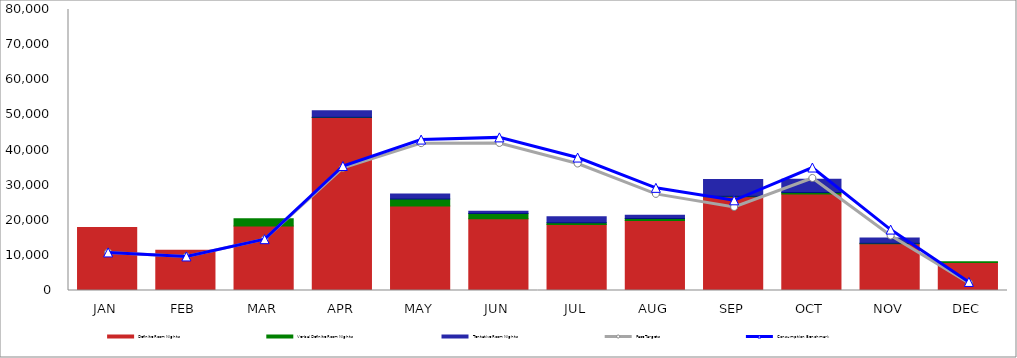
| Category | Definite Room Nights | Verbal Definite Room Nights | Tentative Room Nights |
|---|---|---|---|
| JAN | 17918 | 0 | 0 |
| FEB | 11445 | 0 | 0 |
| MAR | 18391 | 2060 | 0 |
| APR | 49251 | 60 | 1897 |
| MAY | 24036 | 1998 | 1459 |
| JUN | 20452 | 1447 | 628 |
| JUL | 18794 | 464 | 1740 |
| AUG | 19923 | 600 | 880 |
| SEP | 26686 | 115 | 4791 |
| OCT | 27447 | 463 | 3752 |
| NOV | 13281 | 202 | 1448 |
| DEC | 7968 | 240 | 0 |